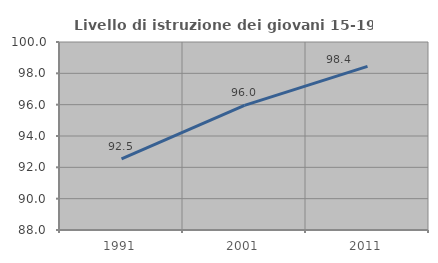
| Category | Livello di istruzione dei giovani 15-19 anni |
|---|---|
| 1991.0 | 92.534 |
| 2001.0 | 95.951 |
| 2011.0 | 98.444 |